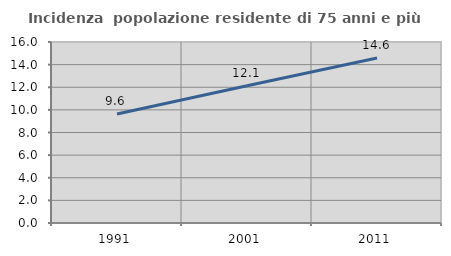
| Category | Incidenza  popolazione residente di 75 anni e più |
|---|---|
| 1991.0 | 9.633 |
| 2001.0 | 12.134 |
| 2011.0 | 14.585 |